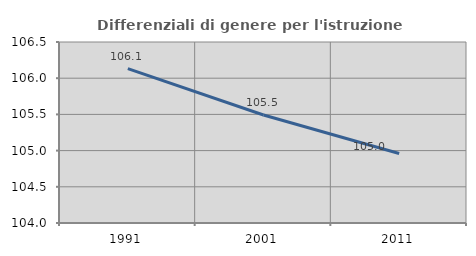
| Category | Differenziali di genere per l'istruzione superiore |
|---|---|
| 1991.0 | 106.131 |
| 2001.0 | 105.492 |
| 2011.0 | 104.96 |